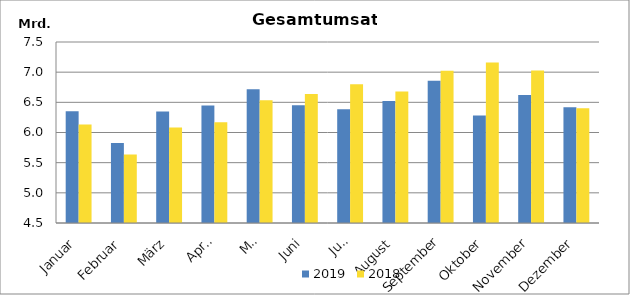
| Category | 2019 | 2018 |
|---|---|---|
| Januar | 6351719.701 | 6134361.706 |
| Februar | 5824979.928 | 5635775.01 |
| März | 6349789.74 | 6082404.325 |
| April | 6447845.802 | 6171217.28 |
| Mai | 6717887.417 | 6532797.242 |
| Juni | 6449611.76 | 6637029.577 |
| Juli | 6387046.473 | 6800316.073 |
| August | 6521550.086 | 6679467.454 |
| September | 6858650.875 | 7024626.623 |
| Oktober | 6280640.61 | 7162114.84 |
| November | 6620921.169 | 7027715.98 |
| Dezember | 6418518.197 | 6402543.473 |